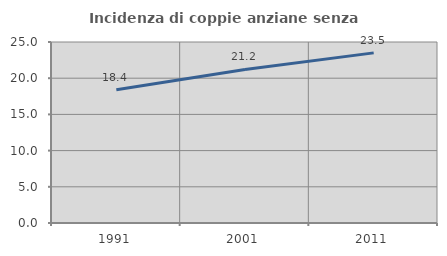
| Category | Incidenza di coppie anziane senza figli  |
|---|---|
| 1991.0 | 18.396 |
| 2001.0 | 21.212 |
| 2011.0 | 23.497 |